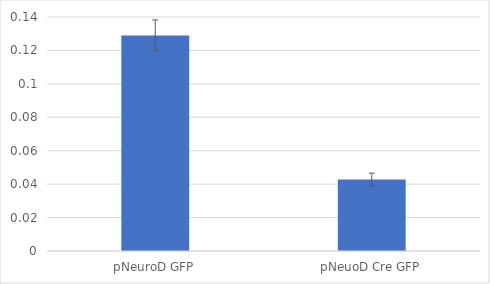
| Category | Series 0 |
|---|---|
| pNeuroD GFP | 0.129 |
| pNeuoD Cre GFP | 0.043 |